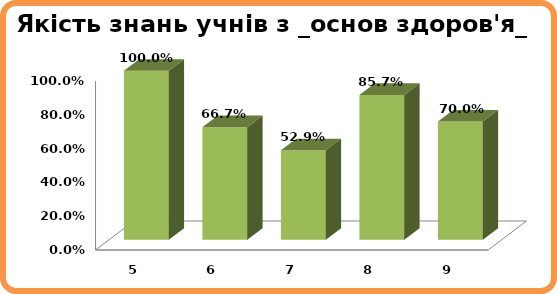
| Category | Series 0 |
|---|---|
| 5.0 | 1 |
| 6.0 | 0.667 |
| 7.0 | 0.529 |
| 8.0 | 0.857 |
| 9.0 | 0.7 |